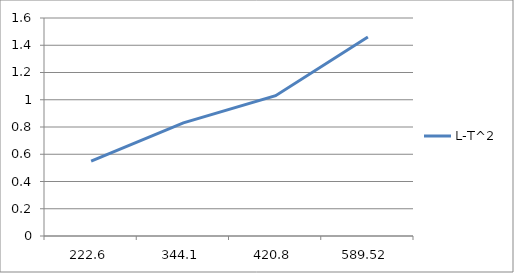
| Category | L-T^2 |
|---|---|
| 222,6 | 0.55 |
| 344,1 | 0.83 |
| 420,8 | 1.03 |
| 589.52 | 1.46 |